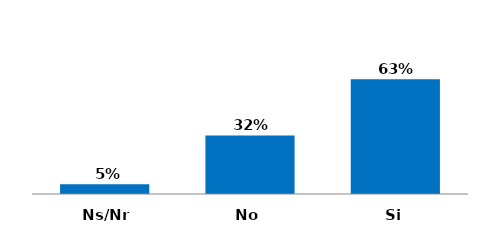
| Category | Series 0 |
|---|---|
| Si | 0.627 |
| No | 0.32 |
| Ns/Nr | 0.053 |